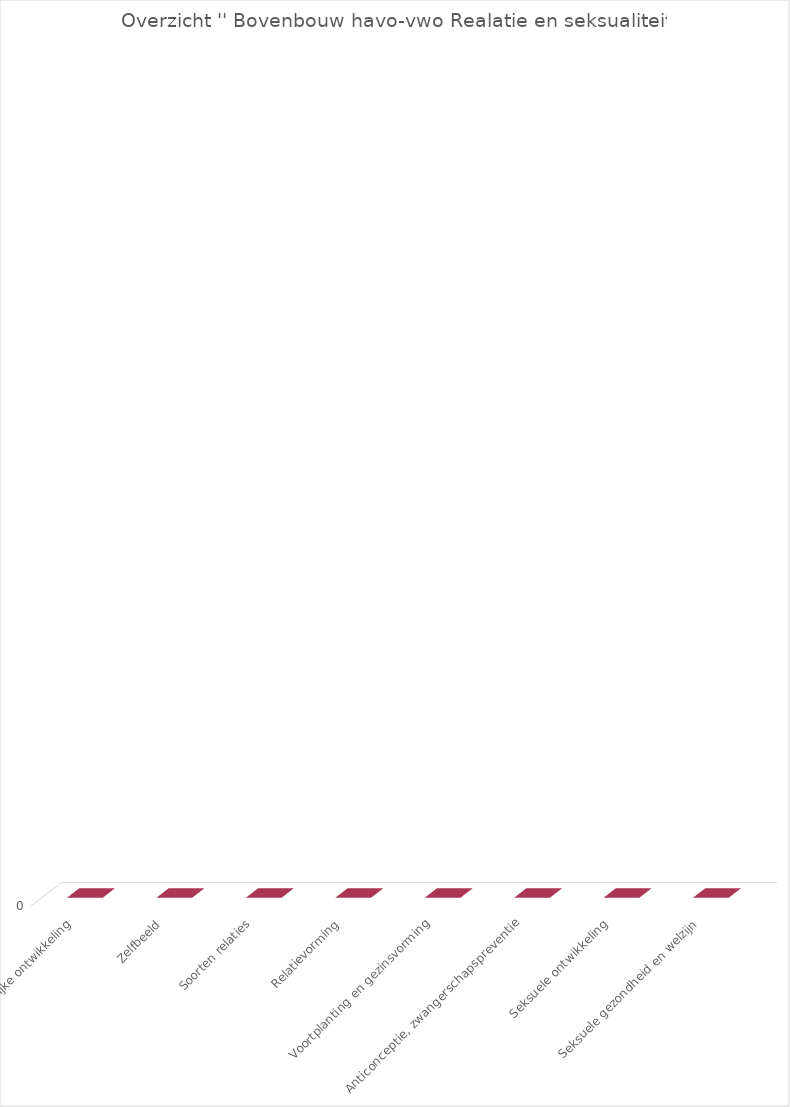
| Category | Series 2 |
|---|---|
| Lichamelijke ontwikkeling | 0 |
| Zelfbeeld | 0 |
| Soorten relaties | 0 |
| Relatievorming | 0 |
| Voortplanting en gezinsvorming | 0 |
| Anticonceptie, zwangerschapspreventie | 0 |
| Seksuele ontwikkeling | 0 |
| Seksuele gezondheid en welzijn | 0 |